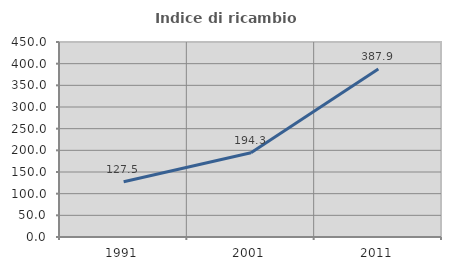
| Category | Indice di ricambio occupazionale  |
|---|---|
| 1991.0 | 127.492 |
| 2001.0 | 194.298 |
| 2011.0 | 387.886 |